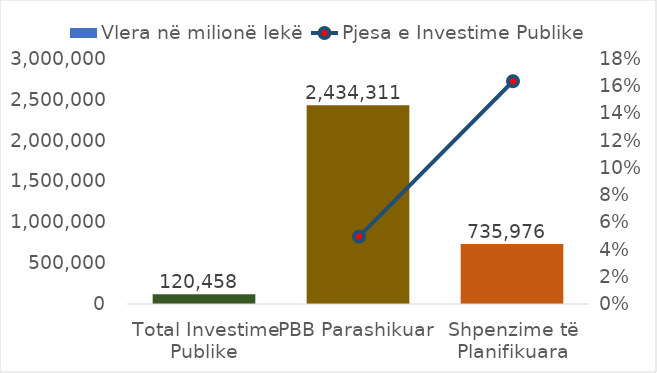
| Category | Vlera në milionë lekë |
|---|---|
| Total Investime Publike | 120458 |
| PBB Parashikuar | 2434311.354 |
| Shpenzime të Planifikuara | 735976.338 |